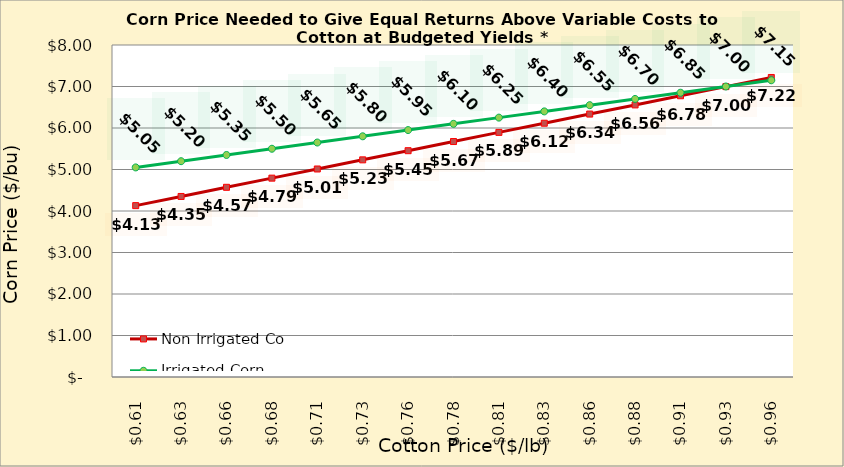
| Category | Non Irrigated Corn | Irrigated Corn |
|---|---|---|
| 0.6049999999999999 | 4.13 | 5.05 |
| 0.6299999999999999 | 4.35 | 5.2 |
| 0.6549999999999999 | 4.571 | 5.35 |
| 0.6799999999999999 | 4.792 | 5.5 |
| 0.705 | 5.012 | 5.65 |
| 0.73 | 5.233 | 5.8 |
| 0.755 | 5.453 | 5.95 |
| 0.78 | 5.674 | 6.1 |
| 0.805 | 5.894 | 6.25 |
| 0.8300000000000001 | 6.115 | 6.4 |
| 0.8550000000000001 | 6.336 | 6.55 |
| 0.8800000000000001 | 6.556 | 6.7 |
| 0.9050000000000001 | 6.777 | 6.85 |
| 0.9300000000000002 | 6.997 | 7 |
| 0.9550000000000002 | 7.218 | 7.15 |